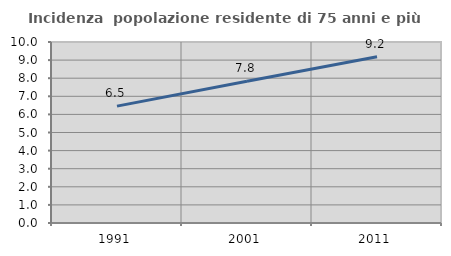
| Category | Incidenza  popolazione residente di 75 anni e più |
|---|---|
| 1991.0 | 6.458 |
| 2001.0 | 7.828 |
| 2011.0 | 9.185 |